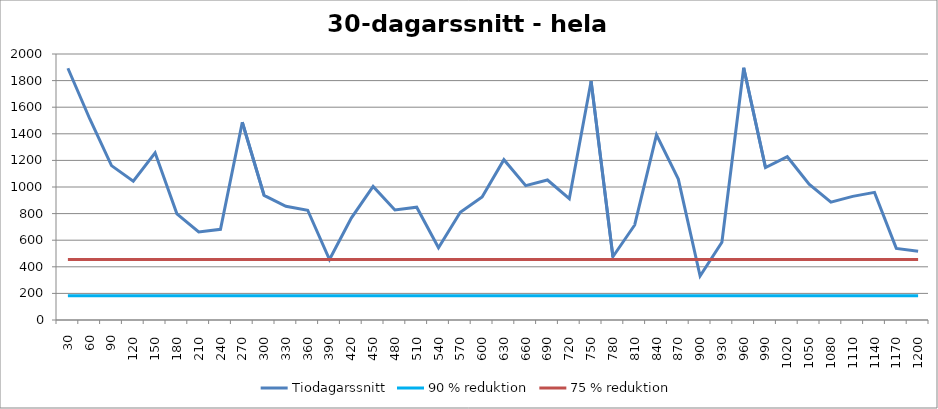
| Category | Tiodagarssnitt | 90 % reduktion | 75 % reduktion |
|---|---|---|---|
| 30.0 | 1892.833 | 182.15 | 455.375 |
| 60.0 | 1513.333 | 182.15 | 455.375 |
| 90.0 | 1160.667 | 182.15 | 455.375 |
| 120.0 | 1043.833 | 182.15 | 455.375 |
| 150.0 | 1256.833 | 182.15 | 455.375 |
| 180.0 | 798.5 | 182.15 | 455.375 |
| 210.0 | 662.667 | 182.15 | 455.375 |
| 240.0 | 682.167 | 182.15 | 455.375 |
| 270.0 | 1487.167 | 182.15 | 455.375 |
| 300.0 | 937.167 | 182.15 | 455.375 |
| 330.0 | 854.5 | 182.15 | 455.375 |
| 360.0 | 825.167 | 182.15 | 455.375 |
| 390.0 | 455 | 182.15 | 455.375 |
| 420.0 | 766.333 | 182.15 | 455.375 |
| 450.0 | 1003.667 | 182.15 | 455.375 |
| 480.0 | 827.333 | 182.15 | 455.375 |
| 510.0 | 848 | 182.15 | 455.375 |
| 540.0 | 542.667 | 182.15 | 455.375 |
| 570.0 | 810.4 | 182.15 | 455.375 |
| 600.0 | 924.667 | 182.15 | 455.375 |
| 630.0 | 1205.4 | 182.15 | 455.375 |
| 660.0 | 1010 | 182.15 | 455.375 |
| 690.0 | 1052.567 | 182.15 | 455.375 |
| 720.0 | 912.133 | 182.15 | 455.375 |
| 750.0 | 1795.733 | 182.15 | 455.375 |
| 780.0 | 475.633 | 182.15 | 455.375 |
| 810.0 | 714.467 | 182.15 | 455.375 |
| 840.0 | 1391.767 | 182.15 | 455.375 |
| 870.0 | 1059.6 | 182.15 | 455.375 |
| 900.0 | 330.533 | 182.15 | 455.375 |
| 930.0 | 584.6 | 182.15 | 455.375 |
| 960.0 | 1896.967 | 182.15 | 455.375 |
| 990.0 | 1146.667 | 182.15 | 455.375 |
| 1020.0 | 1227.5 | 182.15 | 455.375 |
| 1050.0 | 1020.433 | 182.15 | 455.375 |
| 1080.0 | 885.833 | 182.15 | 455.375 |
| 1110.0 | 929.333 | 182.15 | 455.375 |
| 1140.0 | 959.667 | 182.15 | 455.375 |
| 1170.0 | 538.5 | 182.15 | 455.375 |
| 1200.0 | 516.833 | 182.15 | 455.375 |